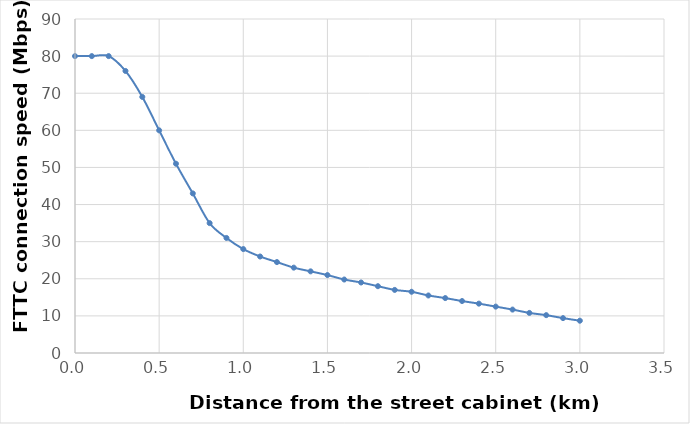
| Category | FTTC connection speed (Mbps) |
|---|---|
| 0.0 | 80 |
| 0.1 | 80 |
| 0.2 | 80 |
| 0.3 | 76 |
| 0.4 | 69 |
| 0.5 | 60 |
| 0.6 | 51 |
| 0.7 | 43 |
| 0.8 | 35 |
| 0.9 | 31 |
| 1.0 | 28 |
| 1.1 | 26 |
| 1.2 | 24.5 |
| 1.3 | 23 |
| 1.4 | 22 |
| 1.5 | 21 |
| 1.6 | 19.8 |
| 1.7 | 19 |
| 1.8 | 18 |
| 1.9 | 17 |
| 2.0 | 16.5 |
| 2.1 | 15.5 |
| 2.2 | 14.8 |
| 2.3 | 14 |
| 2.4 | 13.3 |
| 2.5 | 12.5 |
| 2.6 | 11.7 |
| 2.7 | 10.8 |
| 2.8 | 10.2 |
| 2.9 | 9.4 |
| 3.0 | 8.7 |